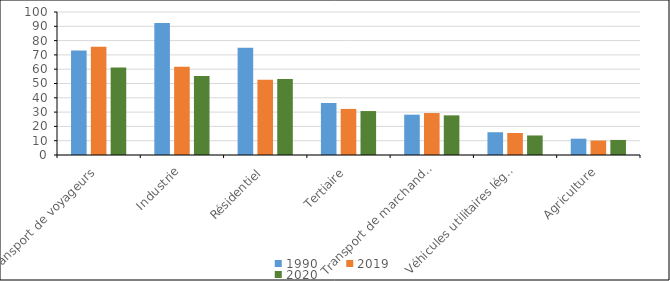
| Category | 1990 | 2019 | 2020 |
|---|---|---|---|
| Transport de voyageurs | 73.141 | 75.776 | 61.256 |
| Industrie | 92.374 | 61.796 | 55.234 |
| Résidentiel | 74.94 | 52.703 | 53.177 |
| Tertiaire | 36.427 | 32.236 | 30.735 |
| Transport de marchandises | 28.192 | 29.339 | 27.717 |
| Véhicules utilitaires légers | 15.925 | 15.395 | 13.659 |
| Agriculture | 11.409 | 10.092 | 10.537 |